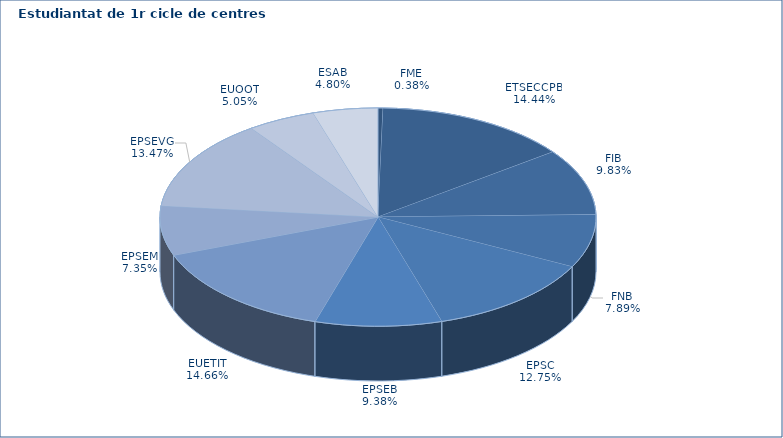
| Category | Series 0 |
|---|---|
| FME | 26 |
| ETSECCPB | 998 |
| FIB | 679 |
| FNB | 545 |
| EPSC | 881 |
| EPSEB | 648 |
| EUETIT | 1013 |
| EPSEM | 508 |
| EPSEVG | 931 |
| EUOOT | 349 |
| ESAB | 332 |